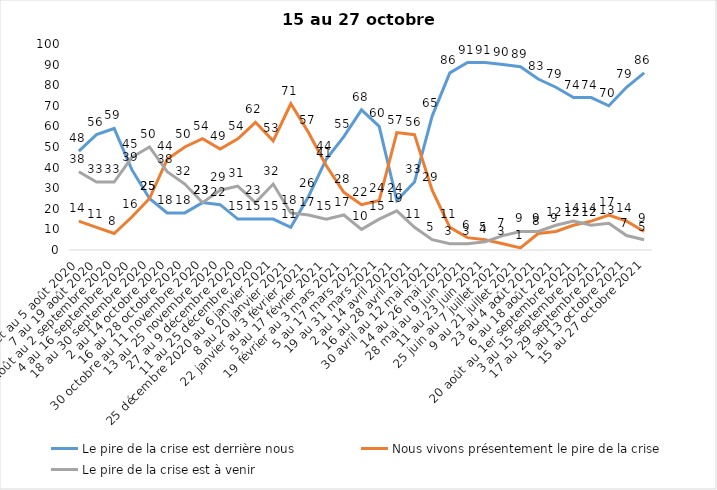
| Category | Le pire de la crise est derrière nous | Nous vivons présentement le pire de la crise | Le pire de la crise est à venir |
|---|---|---|---|
| 24 juillet au 5 août 2020 | 48 | 14 | 38 |
| 7 au 19 août 2020 | 56 | 11 | 33 |
| 21 août au 2 septembre 2020 | 59 | 8 | 33 |
| 4 au 16 septembre 2020 | 39 | 16 | 45 |
| 18 au 30 septembre 2020 | 25 | 25 | 50 |
| 2 au 14 octobre 2020 | 18 | 44 | 38 |
| 16 au 28 octobre 2020 | 18 | 50 | 32 |
| 30 octobre au 11 novembre 2020 | 23 | 54 | 23 |
| 13 au 25 novembre 2020 | 22 | 49 | 29 |
| 27 au 9 décembre 2020 | 15 | 54 | 31 |
| 11 au 25 décembre 2020 | 15 | 62 | 23 |
| 25 décembre 2020 au 6 janvier 2021 | 15 | 53 | 32 |
| 8 au 20 janvier 2021 | 11 | 71 | 18 |
| 22 janvier au 3 février 2021 | 26 | 57 | 17 |
| 5 au 17 février 2021 | 44 | 41 | 15 |
| 19 février au 3 mars 2021 | 55 | 28 | 17 |
| 5 au 17 mars 2021 | 68 | 22 | 10 |
| 19 au 31 mars 2021 | 60 | 24 | 15 |
| 2 au 14 avril 2021 | 24 | 57 | 19 |
| 16 au 28 avril 2021 | 33 | 56 | 11 |
| 30 avril au 12 mai 2021 | 65 | 29 | 5 |
| 14 au 26 mai 2021 | 86 | 11 | 3 |
| 28 mai au 9 juin 2021 | 91 | 6 | 3 |
| 11 au 23 juin 2021 | 91 | 5 | 4 |
| 25 juin au 7 juillet 2021 | 90 | 3 | 7 |
| 9 au 21 juillet 2021 | 89 | 1 | 9 |
| 23 au 4 août 2021 | 83 | 8 | 9 |
| 6 au 18 août 2021 | 79 | 9 | 12 |
| 20 août au 1er septembre 2021 | 74 | 12 | 14 |
| 3 au 15 septembre 2021 | 74 | 14 | 12 |
| 17 au 29 septembre 2021 | 70 | 17 | 13 |
| 1 au 13 octobre 2021 | 79 | 14 | 7 |
| 15 au 27 octobre 2021 | 86 | 9 | 5 |